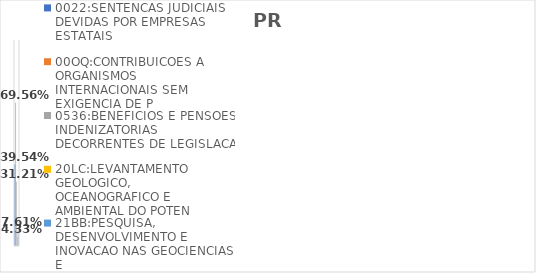
| Category | 0022:SENTENCAS JUDICIAIS DEVIDAS POR EMPRESAS ESTATAIS | 00OQ:CONTRIBUICOES A ORGANISMOS INTERNACIONAIS SEM EXIGENCIA DE P | 0536:BENEFICIOS E PENSOES INDENIZATORIAS DECORRENTES DE LEGISLACA | 20LC:LEVANTAMENTO GEOLOGICO, OCEANOGRAFICO E AMBIENTAL DO POTEN | 21BB:PESQUISA, DESENVOLVIMENTO E INOVACAO NAS GEOCIENCIAS E |
|---|---|---|---|---|---|
| EXECUTADO | 0.395 | 0.696 | 0.312 | 0.043 | 0.076 |